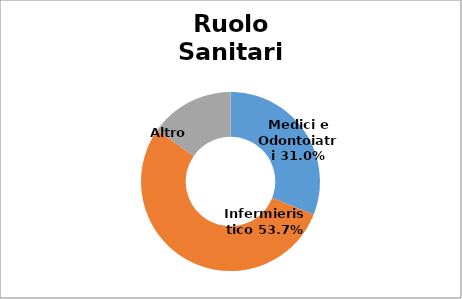
| Category | Series 0 |
|---|---|
| Medici e Odontoiatri | 0.31 |
| Infermieristico | 0.537 |
| Altro  | 0.153 |